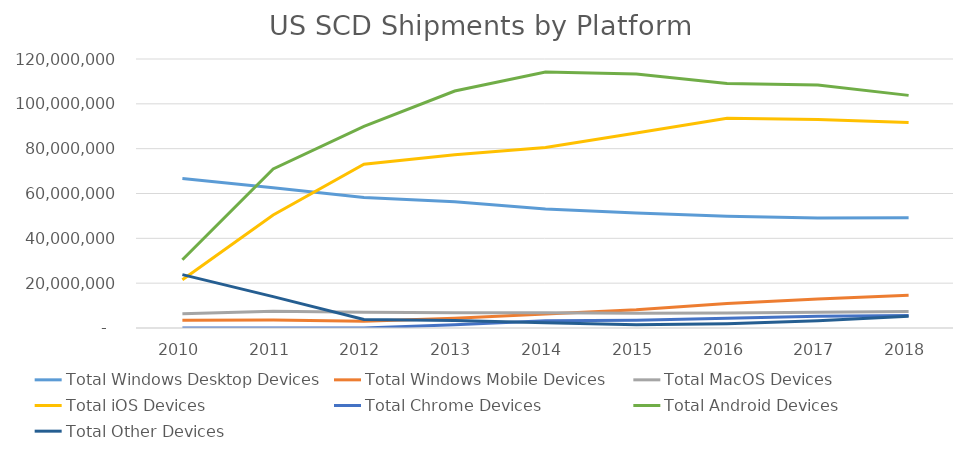
| Category | Total Windows Desktop Devices | Total Windows Mobile Devices | Total MacOS Devices | Total iOS Devices | Total Chrome Devices | Total Android Devices | Total Other Devices |
|---|---|---|---|---|---|---|---|
| 2010.0 | 66728090 | 3496703 | 6407070 | 21483403 | 0 | 30431505 | 23793216 |
| 2011.0 | 62537161 | 3539991 | 7438773 | 50411497 | 0 | 70938398 | 14002552 |
| 2012.0 | 58269408 | 3051593 | 7030793 | 73056077 | 0 | 89902479 | 3844303 |
| 2013.0 | 56333181 | 4358821 | 6793749 | 77253435 | 1437547 | 105724414 | 3306318 |
| 2014.0 | 53069926 | 6268874 | 6798867 | 80504633 | 3189955 | 114162241 | 2335464 |
| 2015.0 | 51260988 | 8130725 | 6618949 | 86952303 | 3484936 | 113257291 | 1478225 |
| 2016.0 | 49851790 | 10891171 | 6742364 | 93605837 | 4329440 | 109106373 | 1911974 |
| 2017.0 | 49091474 | 12977052 | 6997313 | 93012468 | 5212187 | 108350352 | 3183786 |
| 2018.0 | 49221729 | 14652194 | 7343180 | 91670620 | 5563154 | 103776834 | 5296190 |